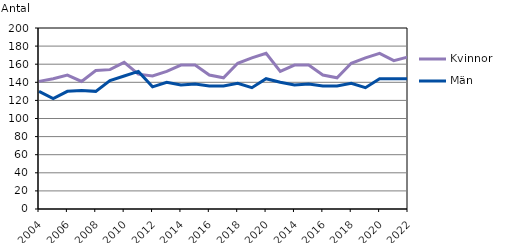
| Category | Kvinnor | Män |
|---|---|---|
| 2004 | 141 | 130 |
| 2005 | 144 | 122 |
| 2006 | 148 | 130 |
| 2007 | 141 | 131 |
| 2008 | 153 | 130 |
| 2009 | 154 | 142 |
| 2010 | 162 | 147 |
| 2011 | 149 | 152 |
| 2012 | 147 | 135 |
| 2013 | 152 | 140 |
| 2014 | 159 | 137 |
| 2015 | 159 | 138 |
| 2016 | 148 | 136 |
| 2017 | 145 | 136 |
| 2018 | 161 | 139 |
| 2019 | 167 | 134 |
| 2020 | 172 | 144 |
| 2013 | 152 | 140 |
| 2014 | 159 | 137 |
| 2015 | 159 | 138 |
| 2016 | 148 | 136 |
| 2017 | 145 | 136 |
| 2018 | 161 | 139 |
| 2019 | 167 | 134 |
| 2020 | 172 | 144 |
| 2021 | 164 | 144 |
| 2022 | 168 | 144 |